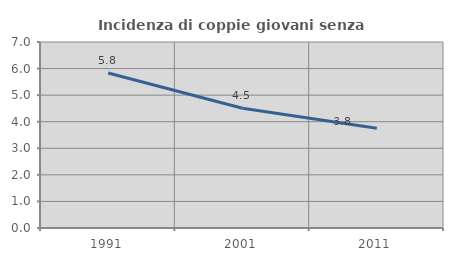
| Category | Incidenza di coppie giovani senza figli |
|---|---|
| 1991.0 | 5.832 |
| 2001.0 | 4.509 |
| 2011.0 | 3.75 |